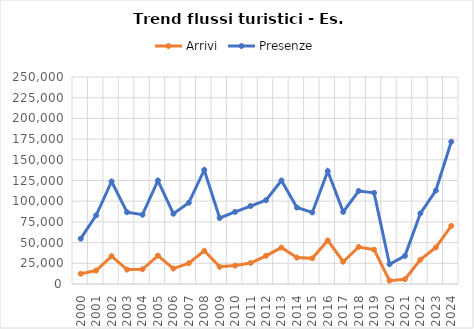
| Category | Arrivi | Presenze |
|---|---|---|
| 2000.0 | 12432 | 54724 |
| 2001.0 | 16257 | 83017 |
| 2002.0 | 33584 | 123822 |
| 2003.0 | 17377 | 86684 |
| 2004.0 | 17784 | 83682 |
| 2005.0 | 34267 | 124944 |
| 2006.0 | 18628 | 84845 |
| 2007.0 | 25170 | 98161 |
| 2008.0 | 40134 | 137733 |
| 2009.0 | 20783 | 79738 |
| 2010.0 | 22299 | 87080 |
| 2011.0 | 25370 | 94164 |
| 2012.0 | 34045 | 101202 |
| 2013.0 | 43992 | 125027 |
| 2014.0 | 31915 | 92332 |
| 2015.0 | 30983 | 86400 |
| 2016.0 | 52579 | 136266 |
| 2017.0 | 26913 | 87079 |
| 2018.0 | 44699 | 112323 |
| 2019.0 | 41465 | 110057 |
| 2020.0 | 4043 | 23845 |
| 2021.0 | 5738 | 33960 |
| 2022.0 | 29361 | 85352 |
| 2023.0 | 44217 | 112937 |
| 2024.0 | 70158 | 171785 |